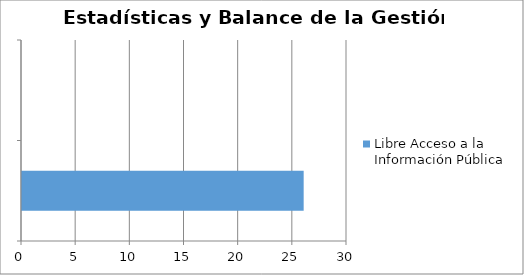
| Category | Libre Acceso a la Información Pública |
|---|---|
|  | 26 |
|  | 0 |